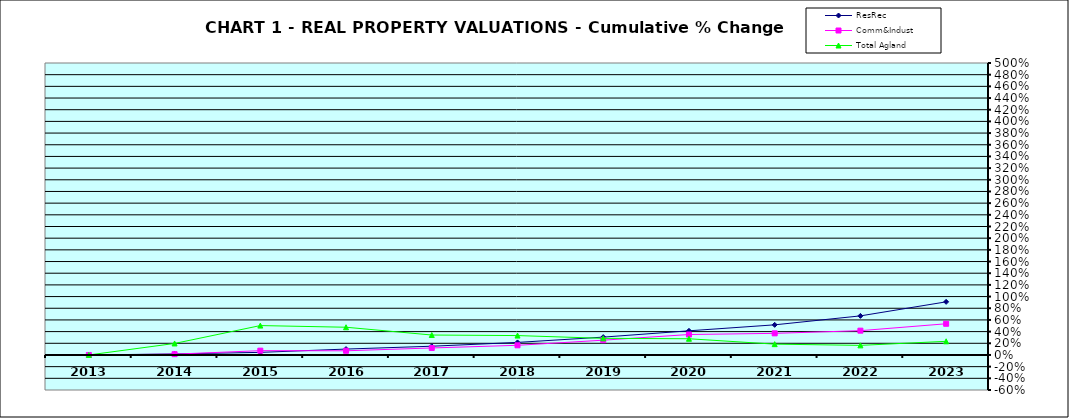
| Category | ResRec | Comm&Indust | Total Agland |
|---|---|---|---|
| 2013.0 | 0 | 0 | 0 |
| 2014.0 | 0.017 | 0.014 | 0.197 |
| 2015.0 | 0.044 | 0.074 | 0.503 |
| 2016.0 | 0.101 | 0.072 | 0.475 |
| 2017.0 | 0.15 | 0.12 | 0.342 |
| 2018.0 | 0.215 | 0.165 | 0.332 |
| 2019.0 | 0.306 | 0.253 | 0.285 |
| 2020.0 | 0.414 | 0.35 | 0.278 |
| 2021.0 | 0.516 | 0.37 | 0.185 |
| 2022.0 | 0.669 | 0.416 | 0.164 |
| 2023.0 | 0.91 | 0.534 | 0.234 |